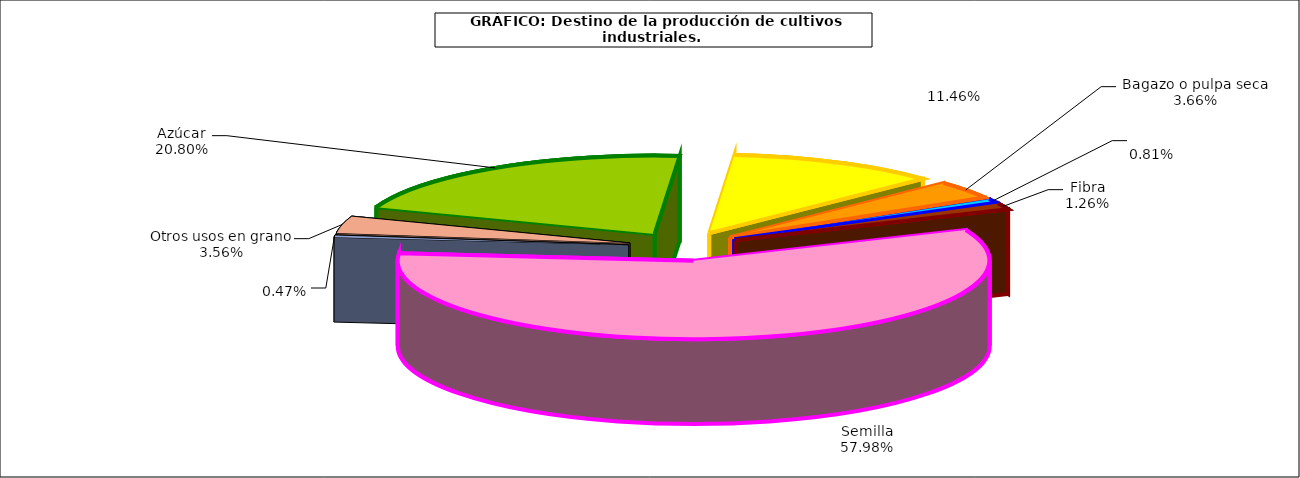
| Category | Series 0 |
|---|---|
|  Azúcar  | 319147 |
|  Bagazo o pulpa seca  | 175877 |
| Fibra | 56205 |
| Semilla | 12423 |
| Otros usos en grano | 19288 |
| Molturación | 889551 |
| Pimentón | 7265 |
| Bio-combustible  | 54575 |